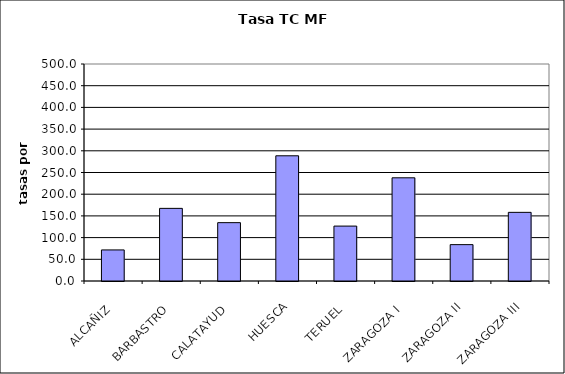
| Category | Series 0 |
|---|---|
| ALCAÑIZ | 71.603 |
| BARBASTRO | 167.356 |
| CALATAYUD | 134.441 |
| HUESCA | 288.503 |
| TERUEL | 126.535 |
| ZARAGOZA I | 237.793 |
| ZARAGOZA II | 83.788 |
| ZARAGOZA III | 158.193 |